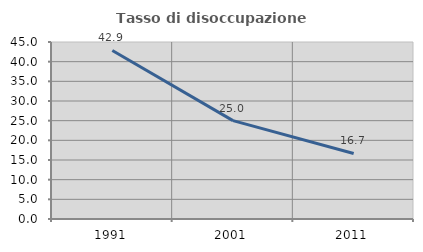
| Category | Tasso di disoccupazione giovanile  |
|---|---|
| 1991.0 | 42.857 |
| 2001.0 | 25 |
| 2011.0 | 16.667 |